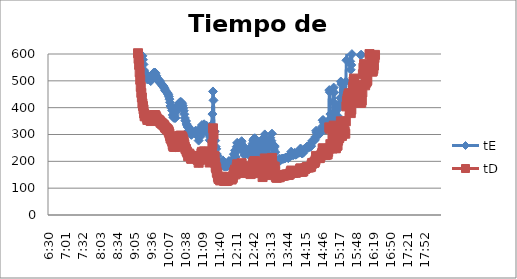
| Category | tE | tD |
|---|---|---|
| 0.2708333333333333 | 166666.667 | 116959.064 |
| 0.27152777777777776 | 166666.667 | 116959.064 |
| 0.2722222222222222 | 166666.667 | 116959.064 |
| 0.27291666666666664 | 166666.667 | 116959.064 |
| 0.2736111111111111 | 166666.667 | 116959.064 |
| 0.2743055555555555 | 166666.667 | 116959.064 |
| 0.275 | 166666.667 | 116959.064 |
| 0.27569444444444446 | 166666.667 | 116959.064 |
| 0.27638888888888885 | 166666.667 | 116959.064 |
| 0.27708333333333335 | 166666.667 | 116959.064 |
| 0.2777777777777778 | 166666.667 | 116959.064 |
| 0.27847222222222223 | 166666.667 | 116959.064 |
| 0.2791666666666667 | 166666.667 | 116959.064 |
| 0.2798611111111111 | 166666.667 | 116959.064 |
| 0.28055555555555556 | 83333.333 | 58479.532 |
| 0.28125 | 83333.333 | 58479.532 |
| 0.28194444444444444 | 83333.333 | 58479.532 |
| 0.2826388888888889 | 83333.333 | 58479.532 |
| 0.2833333333333333 | 83333.333 | 58479.532 |
| 0.28402777777777777 | 83333.333 | 58479.532 |
| 0.2847222222222222 | 83333.333 | 58479.532 |
| 0.28541666666666665 | 83333.333 | 58479.532 |
| 0.28611111111111115 | 55555.556 | 38986.355 |
| 0.28680555555555554 | 55555.556 | 38986.355 |
| 0.2875 | 55555.556 | 38986.355 |
| 0.2881944444444445 | 41666.667 | 29239.766 |
| 0.2888888888888889 | 41666.667 | 29239.766 |
| 0.28958333333333336 | 41666.667 | 29239.766 |
| 0.2902777777777778 | 33333.333 | 23391.813 |
| 0.29097222222222224 | 33333.333 | 23391.813 |
| 0.2916666666666667 | 33333.333 | 23391.813 |
| 0.2923611111111111 | 27777.778 | 19493.177 |
| 0.29305555555555557 | 27777.778 | 19493.177 |
| 0.29375 | 23809.524 | 16708.438 |
| 0.29444444444444445 | 23809.524 | 16708.438 |
| 0.2951388888888889 | 20833.333 | 14619.883 |
| 0.29583333333333334 | 20833.333 | 14619.883 |
| 0.2965277777777778 | 18518.519 | 12995.452 |
| 0.2972222222222222 | 18518.519 | 12995.452 |
| 0.29791666666666666 | 16666.667 | 11695.906 |
| 0.2986111111111111 | 16666.667 | 11695.906 |
| 0.29930555555555555 | 16666.667 | 11695.906 |
| 0.3 | 15151.515 | 10632.642 |
| 0.30069444444444443 | 15151.515 | 10632.642 |
| 0.3013888888888889 | 15151.515 | 10632.642 |
| 0.3020833333333333 | 13888.889 | 9746.589 |
| 0.30277777777777776 | 13888.889 | 9746.589 |
| 0.3034722222222222 | 12820.513 | 8996.851 |
| 0.30416666666666664 | 12820.513 | 8996.851 |
| 0.3048611111111111 | 11904.762 | 8354.219 |
| 0.3055555555555555 | 11904.762 | 8354.219 |
| 0.30625 | 11111.111 | 7797.271 |
| 0.3069444444444444 | 10416.667 | 7309.942 |
| 0.3076388888888889 | 10416.667 | 7309.942 |
| 0.30833333333333335 | 9803.922 | 6879.945 |
| 0.3090277777777778 | 9803.922 | 6879.945 |
| 0.30972222222222223 | 9803.922 | 6879.945 |
| 0.3104166666666667 | 9259.259 | 6497.726 |
| 0.3111111111111111 | 9259.259 | 6497.726 |
| 0.31180555555555556 | 8771.93 | 6155.74 |
| 0.3125 | 8771.93 | 6155.74 |
| 0.31319444444444444 | 8771.93 | 6155.74 |
| 0.3138888888888889 | 8333.333 | 5847.953 |
| 0.3145833333333333 | 8333.333 | 5847.953 |
| 0.31527777777777777 | 7936.508 | 5569.479 |
| 0.3159722222222222 | 7936.508 | 5569.479 |
| 0.31666666666666665 | 7575.758 | 5316.321 |
| 0.31736111111111115 | 7246.377 | 5085.177 |
| 0.31805555555555554 | 6944.444 | 4873.294 |
| 0.31875 | 6410.256 | 4498.426 |
| 0.3194444444444445 | 6172.84 | 4331.817 |
| 0.3201388888888889 | 5747.126 | 4033.071 |
| 0.32083333333333336 | 5376.344 | 3772.873 |
| 0.3215277777777778 | 5050.505 | 3544.214 |
| 0.32222222222222224 | 4761.905 | 3341.688 |
| 0.3229166666666667 | 4504.505 | 3161.056 |
| 0.3236111111111111 | 4273.504 | 2998.95 |
| 0.32430555555555557 | 4065.041 | 2852.66 |
| 0.325 | 3875.969 | 2719.978 |
| 0.32569444444444445 | 3787.879 | 2658.161 |
| 0.3263888888888889 | 3623.188 | 2542.588 |
| 0.32708333333333334 | 3623.188 | 2542.588 |
| 0.3277777777777778 | 3546.099 | 2488.491 |
| 0.3284722222222222 | 3623.188 | 2542.588 |
| 0.32916666666666666 | 3787.879 | 2658.161 |
| 0.3298611111111111 | 3968.254 | 2784.74 |
| 0.33055555555555555 | 4065.041 | 2852.66 |
| 0.33125 | 4166.667 | 2923.977 |
| 0.33194444444444443 | 4166.667 | 2923.977 |
| 0.3326388888888889 | 4065.041 | 2852.66 |
| 0.3333333333333333 | 4065.041 | 2852.66 |
| 0.3340277777777778 | 3875.969 | 2719.978 |
| 0.3347222222222222 | 3623.188 | 2542.588 |
| 0.3354166666666667 | 3401.361 | 2386.92 |
| 0.3361111111111111 | 3144.654 | 2206.775 |
| 0.3368055555555556 | 2923.977 | 2051.913 |
| 0.3375 | 2824.859 | 1982.357 |
| 0.33819444444444446 | 2732.24 | 1917.362 |
| 0.33888888888888885 | 2645.503 | 1856.493 |
| 0.33958333333333335 | 2525.253 | 1772.107 |
| 0.34027777777777773 | 2450.98 | 1719.986 |
| 0.34097222222222223 | 2380.952 | 1670.844 |
| 0.3416666666666666 | 2314.815 | 1624.431 |
| 0.3423611111111111 | 2252.252 | 1580.528 |
| 0.3430555555555555 | 2192.982 | 1538.935 |
| 0.34375 | 2164.502 | 1518.949 |
| 0.3444444444444445 | 2136.752 | 1499.475 |
| 0.3451388888888889 | 2109.705 | 1480.494 |
| 0.3458333333333334 | 2109.705 | 1480.494 |
| 0.34652777777777777 | 2109.705 | 1480.494 |
| 0.34722222222222227 | 2109.705 | 1480.494 |
| 0.34791666666666665 | 2057.613 | 1443.939 |
| 0.34861111111111115 | 1984.127 | 1392.37 |
| 0.34930555555555554 | 1937.984 | 1359.989 |
| 0.35 | 1893.939 | 1329.08 |
| 0.3506944444444444 | 1872.659 | 1314.147 |
| 0.3513888888888889 | 1893.939 | 1329.08 |
| 0.3520833333333333 | 1915.709 | 1344.357 |
| 0.3527777777777778 | 1984.127 | 1392.37 |
| 0.3534722222222222 | 2032.52 | 1426.33 |
| 0.3541666666666667 | 2032.52 | 1426.33 |
| 0.3548611111111111 | 1984.127 | 1392.37 |
| 0.35555555555555557 | 1915.709 | 1344.357 |
| 0.35625 | 1831.502 | 1285.264 |
| 0.35694444444444445 | 1754.386 | 1231.148 |
| 0.3576388888888889 | 1683.502 | 1181.405 |
| 0.35833333333333334 | 1650.165 | 1158.011 |
| 0.3590277777777778 | 1618.123 | 1135.525 |
| 0.3597222222222222 | 1618.123 | 1135.525 |
| 0.36041666666666666 | 1618.123 | 1135.525 |
| 0.3611111111111111 | 1633.987 | 1146.657 |
| 0.36180555555555555 | 1666.667 | 1169.591 |
| 0.3625 | 1700.68 | 1193.46 |
| 0.36319444444444443 | 1754.386 | 1231.148 |
| 0.3638888888888889 | 1792.115 | 1257.624 |
| 0.3645833333333333 | 1792.115 | 1257.624 |
| 0.3652777777777778 | 1773.05 | 1244.245 |
| 0.3659722222222222 | 1736.111 | 1218.324 |
| 0.3666666666666667 | 1683.502 | 1181.405 |
| 0.3673611111111111 | 1633.987 | 1146.657 |
| 0.3680555555555556 | 1572.327 | 1103.387 |
| 0.36875 | 1515.152 | 1063.264 |
| 0.36944444444444446 | 1461.988 | 1025.957 |
| 0.37013888888888885 | 1400.56 | 982.849 |
| 0.37083333333333335 | 1344.086 | 943.218 |
| 0.37152777777777773 | 1291.99 | 906.659 |
| 0.37222222222222223 | 1253.133 | 879.391 |
| 0.3729166666666666 | 1216.545 | 853.716 |
| 0.3736111111111111 | 1199.041 | 841.432 |
| 0.3743055555555555 | 1182.033 | 829.497 |
| 0.375 | 1157.407 | 812.216 |
| 0.3756944444444445 | 1141.553 | 801.089 |
| 0.3763888888888889 | 1118.568 | 784.96 |
| 0.3770833333333334 | 1089.325 | 764.438 |
| 0.37777777777777777 | 1061.571 | 744.962 |
| 0.37847222222222227 | 1028.807 | 721.97 |
| 0.37916666666666665 | 998.004 | 700.354 |
| 0.37986111111111115 | 968.992 | 679.995 |
| 0.38055555555555554 | 941.62 | 660.786 |
| 0.38125 | 910.747 | 639.121 |
| 0.3819444444444444 | 886.525 | 622.123 |
| 0.3826388888888889 | 859.107 | 602.882 |
| 0.3833333333333333 | 829.187 | 581.886 |
| 0.3840277777777778 | 797.448 | 559.613 |
| 0.3847222222222222 | 757.576 | 531.632 |
| 0.3854166666666667 | 718.391 | 504.134 |
| 0.3861111111111111 | 680.272 | 477.384 |
| 0.38680555555555557 | 648.508 | 455.094 |
| 0.3875 | 624.22 | 438.049 |
| 0.38819444444444445 | 593.12 | 416.224 |
| 0.3888888888888889 | 578.704 | 406.108 |
| 0.38958333333333334 | 561.167 | 393.802 |
| 0.3902777777777778 | 539.374 | 378.508 |
| 0.3909722222222222 | 524.109 | 367.796 |
| 0.39166666666666666 | 529.101 | 371.299 |
| 0.3923611111111111 | 525.762 | 368.956 |
| 0.39305555555555555 | 524.109 | 367.796 |
| 0.39375 | 515.996 | 362.102 |
| 0.39444444444444443 | 505.051 | 354.421 |
| 0.3951388888888889 | 512.821 | 359.874 |
| 0.3958333333333333 | 508.13 | 356.583 |
| 0.3965277777777778 | 505.051 | 354.421 |
| 0.3972222222222222 | 505.051 | 354.421 |
| 0.3979166666666667 | 505.051 | 354.421 |
| 0.3986111111111111 | 499.002 | 350.177 |
| 0.3993055555555556 | 509.684 | 357.673 |
| 0.4 | 509.684 | 357.673 |
| 0.40069444444444446 | 509.684 | 357.673 |
| 0.40138888888888885 | 524.109 | 367.796 |
| 0.40208333333333335 | 529.101 | 371.299 |
| 0.40277777777777773 | 529.101 | 371.299 |
| 0.40347222222222223 | 530.786 | 372.481 |
| 0.4041666666666666 | 530.786 | 372.481 |
| 0.4048611111111111 | 525.762 | 368.956 |
| 0.4055555555555555 | 519.211 | 364.358 |
| 0.40625 | 512.821 | 359.874 |
| 0.4069444444444445 | 503.525 | 353.351 |
| 0.4076388888888889 | 506.586 | 355.499 |
| 0.4083333333333334 | 505.051 | 354.421 |
| 0.40902777777777777 | 502.008 | 352.286 |
| 0.40972222222222227 | 500.501 | 351.228 |
| 0.41041666666666665 | 496.032 | 348.092 |
| 0.41111111111111115 | 490.196 | 343.997 |
| 0.41180555555555554 | 490.196 | 343.997 |
| 0.4125 | 487.329 | 341.986 |
| 0.4131944444444444 | 483.092 | 339.012 |
| 0.4138888888888889 | 480.307 | 337.058 |
| 0.4145833333333333 | 480.307 | 337.058 |
| 0.4152777777777778 | 476.19 | 334.169 |
| 0.4159722222222222 | 472.144 | 331.329 |
| 0.4166666666666667 | 465.549 | 326.701 |
| 0.4173611111111111 | 462.963 | 324.886 |
| 0.41805555555555557 | 460.405 | 323.091 |
| 0.41875 | 457.875 | 321.316 |
| 0.41944444444444445 | 455.373 | 319.56 |
| 0.4201388888888889 | 451.671 | 316.962 |
| 0.42083333333333334 | 448.029 | 314.406 |
| 0.4215277777777778 | 440.917 | 309.416 |
| 0.4222222222222222 | 431.779 | 303.003 |
| 0.42291666666666666 | 419.815 | 294.607 |
| 0.4236111111111111 | 406.504 | 285.266 |
| 0.42430555555555555 | 405.515 | 284.572 |
| 0.425 | 397.772 | 279.139 |
| 0.42569444444444443 | 389.408 | 273.269 |
| 0.4263888888888889 | 372.856 | 261.653 |
| 0.4270833333333333 | 364.697 | 255.928 |
| 0.4277777777777778 | 362.319 | 254.259 |
| 0.4284722222222222 | 371.195 | 260.488 |
| 0.4291666666666667 | 361.533 | 253.707 |
| 0.4298611111111111 | 362.319 | 254.259 |
| 0.4305555555555556 | 384.025 | 269.491 |
| 0.43125 | 394.945 | 277.154 |
| 0.43194444444444446 | 400.641 | 281.152 |
| 0.43263888888888885 | 404.531 | 283.881 |
| 0.43333333333333335 | 408.497 | 286.664 |
| 0.43402777777777773 | 413.565 | 290.221 |
| 0.43472222222222223 | 417.711 | 293.13 |
| 0.4354166666666666 | 419.815 | 294.607 |
| 0.4361111111111111 | 420.875 | 295.351 |
| 0.4368055555555555 | 420.875 | 295.351 |
| 0.4375 | 418.76 | 293.867 |
| 0.4381944444444445 | 414.594 | 290.943 |
| 0.4388888888888889 | 407.498 | 285.963 |
| 0.4395833333333334 | 398.724 | 279.806 |
| 0.44027777777777777 | 388.5 | 272.632 |
| 0.44097222222222227 | 375.375 | 263.421 |
| 0.44166666666666665 | 361.533 | 253.707 |
| 0.44236111111111115 | 351.617 | 246.749 |
| 0.44305555555555554 | 350.14 | 245.712 |
| 0.44375 | 339.443 | 238.206 |
| 0.4444444444444444 | 334.672 | 234.858 |
| 0.4451388888888889 | 328.084 | 230.234 |
| 0.4458333333333333 | 312.11 | 219.024 |
| 0.4465277777777778 | 313.873 | 220.262 |
| 0.4472222222222222 | 325.521 | 228.436 |
| 0.4479166666666667 | 316.857 | 222.356 |
| 0.4486111111111111 | 315.657 | 221.513 |
| 0.44930555555555557 | 299.76 | 210.358 |
| 0.45 | 298.686 | 209.604 |
| 0.45069444444444445 | 306.937 | 215.394 |
| 0.4513888888888889 | 309.215 | 216.993 |
| 0.45208333333333334 | 307.503 | 215.792 |
| 0.4527777777777778 | 306.937 | 215.394 |
| 0.4534722222222222 | 307.503 | 215.792 |
| 0.45416666666666666 | 310.366 | 217.801 |
| 0.4548611111111111 | 312.695 | 219.435 |
| 0.45555555555555555 | 313.873 | 220.262 |
| 0.45625 | 310.366 | 217.801 |
| 0.45694444444444443 | 299.76 | 210.358 |
| 0.4576388888888889 | 293.945 | 206.277 |
| 0.4583333333333333 | 293.427 | 205.914 |
| 0.4590277777777778 | 277.316 | 194.607 |
| 0.4597222222222222 | 291.886 | 204.832 |
| 0.4604166666666667 | 306.373 | 214.998 |
| 0.4611111111111111 | 310.945 | 218.207 |
| 0.4618055555555556 | 293.945 | 206.277 |
| 0.4625 | 328.084 | 230.234 |
| 0.46319444444444446 | 335.345 | 235.33 |
| 0.46388888888888885 | 321.13 | 225.355 |
| 0.46458333333333335 | 310.945 | 218.207 |
| 0.46527777777777773 | 328.731 | 230.688 |
| 0.46597222222222223 | 338.066 | 237.239 |
| 0.4666666666666666 | 328.084 | 230.234 |
| 0.4673611111111111 | 325.521 | 228.436 |
| 0.4680555555555555 | 329.381 | 231.144 |
| 0.46875 | 333.333 | 233.918 |
| 0.4694444444444445 | 329.381 | 231.144 |
| 0.4701388888888889 | 314.465 | 220.677 |
| 0.4708333333333334 | 319.898 | 224.49 |
| 0.47152777777777777 | 300.842 | 211.117 |
| 0.47222222222222227 | 304.692 | 213.819 |
| 0.47291666666666665 | 278.707 | 195.584 |
| 0.47361111111111115 | 290.36 | 203.761 |
| 0.47430555555555554 | 326.797 | 229.331 |
| 0.475 | 334.001 | 234.387 |
| 0.4756944444444444 | 335.345 | 235.33 |
| 0.4763888888888889 | 376.223 | 264.016 |
| 0.4770833333333333 | 460.405 | 323.091 |
| 0.4777777777777778 | 427.35 | 299.895 |
| 0.4784722222222222 | 313.873 | 220.262 |
| 0.4791666666666667 | 310.945 | 218.207 |
| 0.4798611111111111 | 277.316 | 194.607 |
| 0.48055555555555557 | 254.453 | 178.563 |
| 0.48125 | 246.548 | 173.016 |
| 0.48194444444444445 | 227.066 | 159.345 |
| 0.4826388888888889 | 220.167 | 154.503 |
| 0.48333333333333334 | 202.265 | 141.941 |
| 0.4840277777777778 | 192.456 | 135.057 |
| 0.4847222222222222 | 191.351 | 134.281 |
| 0.48541666666666666 | 193.573 | 135.841 |
| 0.4861111111111111 | 183.554 | 128.81 |
| 0.48680555555555555 | 190.259 | 133.515 |
| 0.4875 | 191.131 | 134.127 |
| 0.48819444444444443 | 187.477 | 131.563 |
| 0.4888888888888889 | 197.239 | 138.413 |
| 0.4895833333333333 | 203.5 | 142.807 |
| 0.4902777777777778 | 185.598 | 130.244 |
| 0.4909722222222222 | 181.357 | 127.268 |
| 0.4916666666666667 | 184.162 | 129.237 |
| 0.4923611111111111 | 180.375 | 126.579 |
| 0.4930555555555556 | 188.537 | 132.307 |
| 0.49375 | 185.805 | 130.389 |
| 0.49444444444444446 | 180.766 | 126.854 |
| 0.49513888888888885 | 187.688 | 131.711 |
| 0.49583333333333335 | 183.352 | 128.668 |
| 0.49652777777777773 | 193.798 | 135.999 |
| 0.49722222222222223 | 201.288 | 141.255 |
| 0.4979166666666666 | 199.601 | 140.071 |
| 0.4986111111111111 | 192.456 | 135.057 |
| 0.4993055555555555 | 196.309 | 137.761 |
| 0.5 | 192.012 | 134.745 |
| 0.5006944444444444 | 188.324 | 132.157 |
| 0.5013888888888889 | 200.803 | 140.915 |
| 0.5020833333333333 | 197.006 | 138.249 |
| 0.5027777777777778 | 210.704 | 147.862 |
| 0.5034722222222222 | 226.142 | 158.696 |
| 0.5041666666666667 | 227.998 | 159.999 |
| 0.5048611111111111 | 240.848 | 169.016 |
| 0.5055555555555555 | 216.169 | 151.698 |
| 0.50625 | 238.095 | 167.084 |
| 0.5069444444444444 | 254.453 | 178.563 |
| 0.5076388888888889 | 269.251 | 188.948 |
| 0.5083333333333333 | 266.241 | 186.836 |
| 0.5090277777777777 | 257.998 | 181.051 |
| 0.5097222222222222 | 262.055 | 183.898 |
| 0.5104166666666666 | 248.016 | 174.046 |
| 0.5111111111111112 | 252.525 | 177.211 |
| 0.5118055555555555 | 254.842 | 178.836 |
| 0.5125 | 268.384 | 188.34 |
| 0.5131944444444444 | 275.028 | 193.002 |
| 0.513888888888889 | 257.202 | 180.492 |
| 0.5145833333333333 | 259.202 | 181.896 |
| 0.5152777777777778 | 251.004 | 176.143 |
| 0.5159722222222222 | 231.803 | 162.669 |
| 0.5166666666666667 | 222.816 | 156.362 |
| 0.517361111111111 | 242.601 | 170.246 |
| 0.5180555555555556 | 231.803 | 162.669 |
| 0.51875 | 229.885 | 161.323 |
| 0.5194444444444445 | 234.082 | 164.268 |
| 0.5201388888888888 | 231.16 | 162.218 |
| 0.5208333333333334 | 240.154 | 168.529 |
| 0.5215277777777778 | 238.777 | 167.563 |
| 0.5222222222222223 | 236.742 | 166.135 |
| 0.5229166666666667 | 247.28 | 173.53 |
| 0.5236111111111111 | 243.665 | 170.993 |
| 0.5243055555555556 | 217.297 | 152.489 |
| 0.525 | 226.449 | 158.912 |
| 0.5256944444444445 | 220.751 | 154.913 |
| 0.5263888888888889 | 258.398 | 181.332 |
| 0.5270833333333333 | 266.667 | 187.135 |
| 0.5277777777777778 | 276.855 | 194.284 |
| 0.5284722222222222 | 282.008 | 197.9 |
| 0.5291666666666667 | 285.388 | 200.272 |
| 0.5298611111111111 | 285.878 | 200.616 |
| 0.5305555555555556 | 270.124 | 189.561 |
| 0.53125 | 238.436 | 167.323 |
| 0.5319444444444444 | 266.667 | 187.135 |
| 0.5326388888888889 | 256.805 | 180.214 |
| 0.5333333333333333 | 268.817 | 188.644 |
| 0.5340277777777778 | 249.501 | 175.088 |
| 0.5347222222222222 | 222.519 | 156.154 |
| 0.5354166666666667 | 266.667 | 187.135 |
| 0.5361111111111111 | 269.251 | 188.948 |
| 0.5368055555555555 | 258.398 | 181.332 |
| 0.5375 | 267.094 | 187.434 |
| 0.5381944444444444 | 279.642 | 196.24 |
| 0.5388888888888889 | 244.379 | 171.494 |
| 0.5395833333333333 | 201.532 | 141.426 |
| 0.5402777777777777 | 256.805 | 180.214 |
| 0.5409722222222222 | 275.938 | 193.641 |
| 0.5416666666666666 | 282.965 | 198.572 |
| 0.5423611111111112 | 300.3 | 210.737 |
| 0.5430555555555555 | 281.532 | 197.566 |
| 0.54375 | 242.954 | 170.494 |
| 0.5444444444444444 | 233.1 | 163.579 |
| 0.545138888888889 | 229.885 | 161.323 |
| 0.5458333333333333 | 212.044 | 148.803 |
| 0.5465277777777778 | 227.376 | 159.562 |
| 0.5472222222222222 | 256.41 | 179.937 |
| 0.5479166666666667 | 261.233 | 183.321 |
| 0.548611111111111 | 272.331 | 191.11 |
| 0.5493055555555556 | 287.853 | 202.002 |
| 0.55 | 271.444 | 190.487 |
| 0.5506944444444445 | 276.855 | 194.284 |
| 0.5513888888888888 | 303.03 | 212.653 |
| 0.5520833333333334 | 264.55 | 185.649 |
| 0.5527777777777778 | 257.599 | 180.771 |
| 0.5534722222222223 | 245.098 | 171.999 |
| 0.5541666666666667 | 251.383 | 176.409 |
| 0.5548611111111111 | 256.805 | 180.214 |
| 0.5555555555555556 | 234.412 | 164.499 |
| 0.55625 | 203.252 | 142.633 |
| 0.5569444444444445 | 198.413 | 139.237 |
| 0.5576388888888889 | 198.177 | 139.071 |
| 0.5583333333333333 | 203.5 | 142.807 |
| 0.5590277777777778 | 201.288 | 141.255 |
| 0.5597222222222222 | 201.045 | 141.085 |
| 0.5604166666666667 | 209.644 | 147.118 |
| 0.5611111111111111 | 200.562 | 140.745 |
| 0.5618055555555556 | 204.75 | 143.684 |
| 0.5625 | 207.814 | 145.834 |
| 0.5631944444444444 | 207.555 | 145.653 |
| 0.5638888888888889 | 209.118 | 146.749 |
| 0.5645833333333333 | 209.908 | 147.304 |
| 0.5652777777777778 | 209.908 | 147.304 |
| 0.5659722222222222 | 209.644 | 147.118 |
| 0.5666666666666667 | 210.438 | 147.676 |
| 0.5673611111111111 | 210.97 | 148.049 |
| 0.5680555555555555 | 211.506 | 148.425 |
| 0.56875 | 213.95 | 150.14 |
| 0.5694444444444444 | 214.5 | 150.526 |
| 0.5701388888888889 | 214.225 | 150.333 |
| 0.5708333333333333 | 214.225 | 150.333 |
| 0.5715277777777777 | 213.129 | 149.564 |
| 0.5722222222222222 | 212.314 | 148.992 |
| 0.5729166666666666 | 215.61 | 151.305 |
| 0.5736111111111112 | 215.61 | 151.305 |
| 0.5743055555555555 | 220.459 | 154.708 |
| 0.575 | 228.311 | 160.218 |
| 0.5756944444444444 | 236.072 | 165.664 |
| 0.576388888888889 | 231.16 | 162.218 |
| 0.5770833333333333 | 223.714 | 156.992 |
| 0.5777777777777778 | 225.225 | 158.053 |
| 0.5784722222222222 | 223.115 | 156.572 |
| 0.5791666666666667 | 227.998 | 159.999 |
| 0.579861111111111 | 231.481 | 162.443 |
| 0.5805555555555556 | 229.568 | 161.101 |
| 0.58125 | 224.618 | 157.627 |
| 0.5819444444444445 | 225.53 | 158.267 |
| 0.5826388888888888 | 227.998 | 159.999 |
| 0.5833333333333334 | 228.938 | 160.658 |
| 0.5840277777777778 | 232.775 | 163.351 |
| 0.5847222222222223 | 232.775 | 163.351 |
| 0.5854166666666667 | 232.126 | 162.896 |
| 0.5861111111111111 | 234.082 | 164.268 |
| 0.5868055555555556 | 245.098 | 171.999 |
| 0.5875 | 247.647 | 173.788 |
| 0.5881944444444445 | 235.073 | 164.963 |
| 0.5888888888888889 | 229.885 | 161.323 |
| 0.5895833333333333 | 230.84 | 161.993 |
| 0.5902777777777778 | 230.84 | 161.993 |
| 0.5909722222222222 | 232.775 | 163.351 |
| 0.5916666666666667 | 244.021 | 171.243 |
| 0.5923611111111111 | 246.548 | 173.016 |
| 0.5930555555555556 | 244.379 | 171.494 |
| 0.59375 | 247.28 | 173.53 |
| 0.5944444444444444 | 249.875 | 175.351 |
| 0.5951388888888889 | 253.678 | 178.02 |
| 0.5958333333333333 | 253.678 | 178.02 |
| 0.5965277777777778 | 255.624 | 179.385 |
| 0.5972222222222222 | 252.908 | 177.48 |
| 0.5979166666666667 | 252.908 | 177.48 |
| 0.5986111111111111 | 254.453 | 178.563 |
| 0.5993055555555555 | 253.678 | 178.02 |
| 0.6 | 255.232 | 179.11 |
| 0.6006944444444444 | 256.805 | 180.214 |
| 0.6013888888888889 | 268.817 | 188.644 |
| 0.6020833333333333 | 276.396 | 193.962 |
| 0.6027777777777777 | 275.028 | 193.002 |
| 0.6034722222222222 | 276.855 | 194.284 |
| 0.6041666666666666 | 277.316 | 194.607 |
| 0.6048611111111112 | 277.316 | 194.607 |
| 0.6055555555555555 | 282.486 | 198.236 |
| 0.60625 | 291.375 | 204.474 |
| 0.6069444444444444 | 313.873 | 220.262 |
| 0.607638888888889 | 306.373 | 214.998 |
| 0.6083333333333333 | 306.937 | 215.394 |
| 0.6090277777777778 | 308.071 | 216.191 |
| 0.6097222222222222 | 308.071 | 216.191 |
| 0.6104166666666667 | 306.373 | 214.998 |
| 0.611111111111111 | 301.932 | 211.882 |
| 0.6118055555555556 | 303.03 | 212.653 |
| 0.6125 | 312.695 | 219.435 |
| 0.6131944444444445 | 316.256 | 221.934 |
| 0.6138888888888888 | 319.898 | 224.49 |
| 0.6145833333333334 | 328.731 | 230.688 |
| 0.6152777777777778 | 353.107 | 247.795 |
| 0.6159722222222223 | 353.857 | 248.321 |
| 0.6166666666666667 | 344.353 | 241.651 |
| 0.6173611111111111 | 343.643 | 241.153 |
| 0.6180555555555556 | 324.254 | 227.547 |
| 0.61875 | 318.066 | 223.204 |
| 0.6194444444444445 | 319.898 | 224.49 |
| 0.6201388888888889 | 326.158 | 228.883 |
| 0.6208333333333333 | 322.373 | 226.226 |
| 0.6215277777777778 | 321.75 | 225.79 |
| 0.6222222222222222 | 335.345 | 235.33 |
| 0.6229166666666667 | 352.361 | 247.271 |
| 0.6236111111111111 | 465.549 | 326.701 |
| 0.6243055555555556 | 457.875 | 321.316 |
| 0.625 | 376.223 | 264.016 |
| 0.6256944444444444 | 359.971 | 252.611 |
| 0.6263888888888889 | 363.108 | 254.813 |
| 0.6270833333333333 | 358.423 | 251.525 |
| 0.6277777777777778 | 353.107 | 247.795 |
| 0.6284722222222222 | 421.941 | 296.099 |
| 0.6291666666666667 | 474.834 | 333.217 |
| 0.6298611111111111 | 456.621 | 320.436 |
| 0.6305555555555555 | 382.263 | 268.255 |
| 0.63125 | 355.366 | 249.38 |
| 0.6319444444444444 | 354.61 | 248.849 |
| 0.6326388888888889 | 369.549 | 259.333 |
| 0.6333333333333333 | 366.3 | 257.053 |
| 0.6340277777777777 | 369.549 | 259.333 |
| 0.6347222222222222 | 394.945 | 277.154 |
| 0.6354166666666666 | 407.498 | 285.963 |
| 0.6361111111111112 | 408.497 | 286.664 |
| 0.6368055555555555 | 416.667 | 292.398 |
| 0.6375 | 436.3 | 306.176 |
| 0.6381944444444444 | 497.512 | 349.132 |
| 0.638888888888889 | 487.329 | 341.986 |
| 0.6395833333333333 | 419.815 | 294.607 |
| 0.6402777777777778 | 430.663 | 302.22 |
| 0.6409722222222222 | 456.621 | 320.436 |
| 0.6416666666666667 | 434.028 | 304.581 |
| 0.642361111111111 | 466.853 | 327.616 |
| 0.6430555555555556 | 442.087 | 310.236 |
| 0.64375 | 431.779 | 303.003 |
| 0.6444444444444445 | 497.512 | 349.132 |
| 0.6451388888888888 | 576.701 | 404.703 |
| 0.6458333333333334 | 606.061 | 425.306 |
| 0.6465277777777778 | 619.579 | 434.792 |
| 0.6472222222222223 | 631.313 | 443.027 |
| 0.6479166666666667 | 643.501 | 451.579 |
| 0.6486111111111111 | 645.995 | 453.33 |
| 0.6493055555555556 | 628.931 | 441.355 |
| 0.65 | 572.738 | 401.921 |
| 0.6506944444444445 | 541.126 | 379.737 |
| 0.6513888888888889 | 559.284 | 392.48 |
| 0.6520833333333333 | 599.52 | 420.716 |
| 0.6527777777777778 | 641.026 | 449.843 |
| 0.6534722222222222 | 680.272 | 477.384 |
| 0.6541666666666667 | 709.22 | 497.698 |
| 0.6548611111111111 | 724.638 | 508.518 |
| 0.6555555555555556 | 688.705 | 483.302 |
| 0.65625 | 643.501 | 451.579 |
| 0.6569444444444444 | 651.042 | 456.871 |
| 0.6576388888888889 | 680.272 | 477.384 |
| 0.6583333333333333 | 656.168 | 460.469 |
| 0.6590277777777778 | 641.026 | 449.843 |
| 0.6597222222222222 | 638.57 | 448.119 |
| 0.6604166666666667 | 672.043 | 471.609 |
| 0.6611111111111111 | 691.563 | 485.307 |
| 0.6618055555555555 | 669.344 | 469.715 |
| 0.6625 | 615.006 | 431.583 |
| 0.6631944444444444 | 595.238 | 417.711 |
| 0.6638888888888889 | 597.372 | 419.208 |
| 0.6645833333333333 | 608.273 | 426.858 |
| 0.6652777777777777 | 651.042 | 456.871 |
| 0.6659722222222222 | 747.384 | 524.48 |
| 0.6666666666666666 | 782.473 | 549.104 |
| 0.6673611111111111 | 801.282 | 562.303 |
| 0.6680555555555556 | 750.751 | 526.843 |
| 0.66875 | 688.705 | 483.302 |
| 0.6694444444444444 | 700.28 | 491.425 |
| 0.6701388888888888 | 706.215 | 495.589 |
| 0.6708333333333334 | 709.22 | 497.698 |
| 0.6715277777777778 | 715.308 | 501.97 |
| 0.6722222222222222 | 764.526 | 536.509 |
| 0.6729166666666666 | 868.056 | 609.162 |
| 0.6736111111111112 | 896.057 | 628.812 |
| 0.6743055555555556 | 854.701 | 599.79 |
| 0.675 | 793.651 | 556.948 |
| 0.6756944444444444 | 768.049 | 538.982 |
| 0.6763888888888889 | 764.526 | 536.509 |
| 0.6770833333333334 | 764.526 | 536.509 |
| 0.6777777777777777 | 761.035 | 534.06 |
| 0.6784722222222223 | 764.526 | 536.509 |
| 0.6791666666666667 | 775.194 | 543.996 |
| 0.6798611111111111 | 793.651 | 556.948 |
| 0.6805555555555555 | 833.333 | 584.795 |
| 0.68125 | 850.34 | 596.73 |
| 0.6819444444444445 | 992.063 | 696.185 |
| 0.6826388888888889 | 1096.491 | 769.468 |
| 0.6833333333333332 | 1133.787 | 795.64 |
| 0.6840277777777778 | 1141.553 | 801.089 |
| 0.6847222222222222 | 1149.425 | 806.614 |
| 0.6854166666666667 | 1068.376 | 749.738 |
| 0.686111111111111 | 1041.667 | 730.994 |
| 0.6868055555555556 | 1041.667 | 730.994 |
| 0.6875 | 1103.753 | 774.563 |
| 0.6881944444444444 | 1182.033 | 829.497 |
| 0.688888888888889 | 1165.501 | 817.896 |
| 0.6895833333333333 | 1190.476 | 835.422 |
| 0.6902777777777778 | 1377.41 | 966.604 |
| 0.6909722222222222 | 1572.327 | 1103.387 |
| 0.6916666666666668 | 1618.123 | 1135.525 |
| 0.6923611111111111 | 1666.667 | 1169.591 |
| 0.6930555555555555 | 1700.68 | 1193.46 |
| 0.69375 | 1718.213 | 1205.764 |
| 0.6944444444444445 | 1718.213 | 1205.764 |
| 0.6951388888888889 | 1718.213 | 1205.764 |
| 0.6958333333333333 | 1700.68 | 1193.46 |
| 0.6965277777777777 | 1718.213 | 1205.764 |
| 0.6972222222222223 | 1718.213 | 1205.764 |
| 0.6979166666666666 | 1736.111 | 1218.324 |
| 0.6986111111111111 | 1773.05 | 1244.245 |
| 0.6993055555555556 | 1792.115 | 1257.624 |
| 0.7 | 1831.502 | 1285.264 |
| 0.7006944444444444 | 1893.939 | 1329.08 |
| 0.7013888888888888 | 1937.984 | 1359.989 |
| 0.7020833333333334 | 1984.127 | 1392.37 |
| 0.7027777777777778 | 2032.52 | 1426.33 |
| 0.7034722222222222 | 2083.333 | 1461.988 |
| 0.7041666666666666 | 2164.502 | 1518.949 |
| 0.7048611111111112 | 2252.252 | 1580.528 |
| 0.7055555555555556 | 2380.952 | 1670.844 |
| 0.70625 | 2525.253 | 1772.107 |
| 0.7069444444444444 | 2645.503 | 1856.493 |
| 0.7076388888888889 | 2732.24 | 1917.362 |
| 0.7083333333333334 | 2824.859 | 1982.357 |
| 0.7090277777777777 | 2873.563 | 2016.536 |
| 0.7097222222222223 | 2976.19 | 2088.555 |
| 0.7104166666666667 | 3086.42 | 2165.909 |
| 0.7111111111111111 | 3205.128 | 2249.213 |
| 0.7118055555555555 | 3333.333 | 2339.181 |
| 0.7125 | 3546.099 | 2488.491 |
| 0.7131944444444445 | 3703.704 | 2599.09 |
| 0.7138888888888889 | 3968.254 | 2784.74 |
| 0.7145833333333332 | 4385.965 | 3077.87 |
| 0.7152777777777778 | 4761.905 | 3341.688 |
| 0.7159722222222222 | 5208.333 | 3654.971 |
| 0.7166666666666667 | 5555.556 | 3898.635 |
| 0.717361111111111 | 5952.381 | 4177.109 |
| 0.7180555555555556 | 6410.256 | 4498.426 |
| 0.71875 | 6944.444 | 4873.294 |
| 0.7194444444444444 | 7575.758 | 5316.321 |
| 0.720138888888889 | 7936.508 | 5569.479 |
| 0.7208333333333333 | 8771.93 | 6155.74 |
| 0.7215277777777778 | 9259.259 | 6497.726 |
| 0.7222222222222222 | 9803.922 | 6879.945 |
| 0.7229166666666668 | 11111.111 | 7797.271 |
| 0.7236111111111111 | 11904.762 | 8354.219 |
| 0.7243055555555555 | 12820.513 | 8996.851 |
| 0.725 | 13888.889 | 9746.589 |
| 0.7256944444444445 | 13888.889 | 9746.589 |
| 0.7263888888888889 | 15151.515 | 10632.642 |
| 0.7270833333333333 | 16666.667 | 11695.906 |
| 0.7277777777777777 | 16666.667 | 11695.906 |
| 0.7284722222222223 | 16666.667 | 11695.906 |
| 0.7291666666666666 | 16666.667 | 11695.906 |
| 0.7298611111111111 | 16666.667 | 11695.906 |
| 0.7305555555555556 | 16666.667 | 11695.906 |
| 0.73125 | 16666.667 | 11695.906 |
| 0.7319444444444444 | 16666.667 | 11695.906 |
| 0.7326388888888888 | 16666.667 | 11695.906 |
| 0.7333333333333334 | 16666.667 | 11695.906 |
| 0.7340277777777778 | 16666.667 | 11695.906 |
| 0.7347222222222222 | 16666.667 | 11695.906 |
| 0.7354166666666666 | 16666.667 | 11695.906 |
| 0.7361111111111112 | 16666.667 | 11695.906 |
| 0.7368055555555556 | 16666.667 | 11695.906 |
| 0.7375 | 16666.667 | 11695.906 |
| 0.7381944444444444 | 16666.667 | 11695.906 |
| 0.7388888888888889 | 16666.667 | 11695.906 |
| 0.7395833333333334 | 18518.519 | 12995.452 |
| 0.7402777777777777 | 18518.519 | 12995.452 |
| 0.7409722222222223 | 18518.519 | 12995.452 |
| 0.7416666666666667 | 18518.519 | 12995.452 |
| 0.7423611111111111 | 20833.333 | 14619.883 |
| 0.7430555555555555 | 20833.333 | 14619.883 |
| 0.74375 | 20833.333 | 14619.883 |
| 0.7444444444444445 | 23809.524 | 16708.438 |
| 0.7451388888888889 | 23809.524 | 16708.438 |
| 0.7458333333333332 | 23809.524 | 16708.438 |
| 0.7465277777777778 | 27777.778 | 19493.177 |
| 0.7472222222222222 | 27777.778 | 19493.177 |
| 0.7479166666666667 | 27777.778 | 19493.177 |
| 0.748611111111111 | 27777.778 | 19493.177 |
| 0.7493055555555556 | 33333.333 | 23391.813 |
| 0.75 | 33333.333 | 23391.813 |
| 0.7506944444444444 | 33333.333 | 23391.813 |
| 0.751388888888889 | 33333.333 | 23391.813 |
| 0.7520833333333333 | 33333.333 | 23391.813 |
| 0.7527777777777778 | 41666.667 | 29239.766 |
| 0.7534722222222222 | 41666.667 | 29239.766 |
| 0.7541666666666668 | 41666.667 | 29239.766 |
| 0.7548611111111111 | 55555.556 | 38986.355 |
| 0.7555555555555555 | 55555.556 | 38986.355 |
| 0.75625 | 83333.333 | 58479.532 |
| 0.7569444444444445 | 83333.333 | 58479.532 |
| 0.7576388888888889 | 83333.333 | 58479.532 |
| 0.7583333333333333 | 83333.333 | 58479.532 |
| 0.7590277777777777 | 83333.333 | 58479.532 |
| 0.7597222222222223 | 83333.333 | 58479.532 |
| 0.7604166666666666 | 83333.333 | 58479.532 |
| 0.7611111111111111 | 166666.667 | 116959.064 |
| 0.7618055555555556 | 166666.667 | 116959.064 |
| 0.7625 | 166666.667 | 116959.064 |
| 0.7631944444444444 | 166666.667 | 116959.064 |
| 0.7638888888888888 | 166666.667 | 116959.064 |
| 0.7645833333333334 | 166666.667 | 116959.064 |
| 0.7652777777777778 | 166666.667 | 116959.064 |